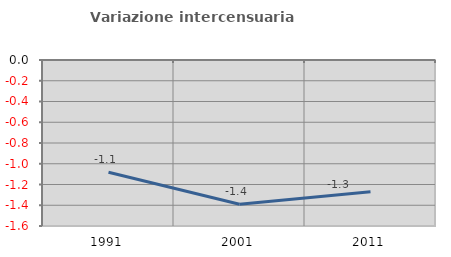
| Category | Variazione intercensuaria annua |
|---|---|
| 1991.0 | -1.083 |
| 2001.0 | -1.39 |
| 2011.0 | -1.271 |